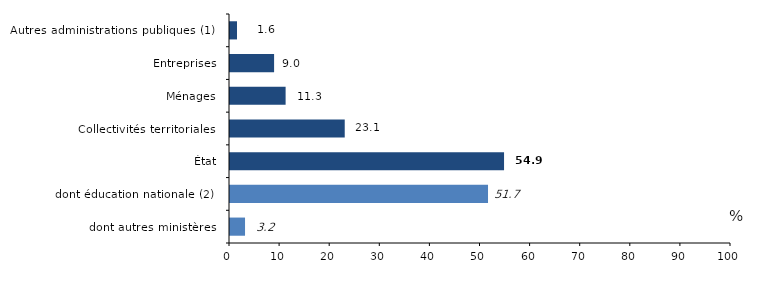
| Category | Series 0 |
|---|---|
| dont autres ministères | 3.2 |
| dont éducation nationale (2) | 51.7 |
| État | 54.9 |
| Collectivités territoriales | 23.1 |
| Ménages | 11.3 |
|  Entreprises | 9 |
| Autres administrations publiques (1) | 1.6 |